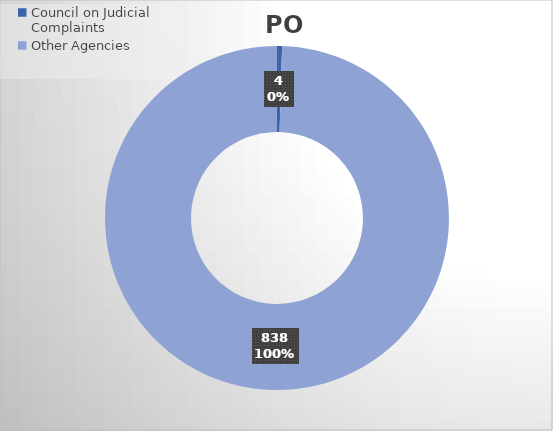
| Category | PO Lines |
|---|---|
| Council on Judicial Complaints | 4 |
| Other Agencies | 838 |